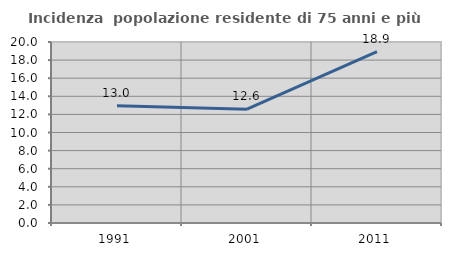
| Category | Incidenza  popolazione residente di 75 anni e più |
|---|---|
| 1991.0 | 12.967 |
| 2001.0 | 12.575 |
| 2011.0 | 18.925 |